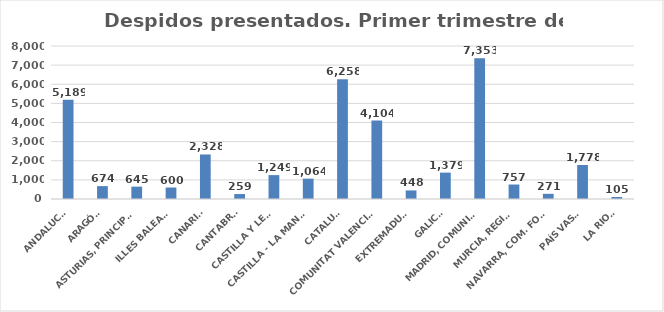
| Category | 616 |
|---|---|
| ANDALUCÍA | 5189 |
| ARAGÓN | 674 |
| ASTURIAS, PRINCIPADO | 645 |
| ILLES BALEARS | 600 |
| CANARIAS | 2328 |
| CANTABRIA | 259 |
| CASTILLA Y LEÓN | 1249 |
| CASTILLA - LA MANCHA | 1064 |
| CATALUÑA | 6258 |
| COMUNITAT VALENCIANA | 4104 |
| EXTREMADURA | 448 |
| GALICIA | 1379 |
| MADRID, COMUNIDAD | 7353 |
| MURCIA, REGIÓN | 757 |
| NAVARRA, COM. FORAL | 271 |
| PAÍS VASCO | 1778 |
| LA RIOJA | 105 |